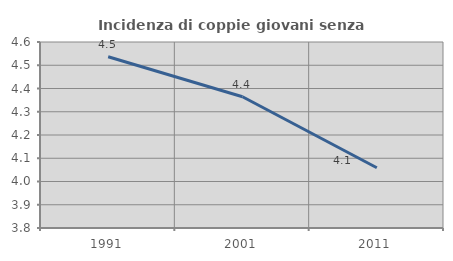
| Category | Incidenza di coppie giovani senza figli |
|---|---|
| 1991.0 | 4.536 |
| 2001.0 | 4.364 |
| 2011.0 | 4.059 |